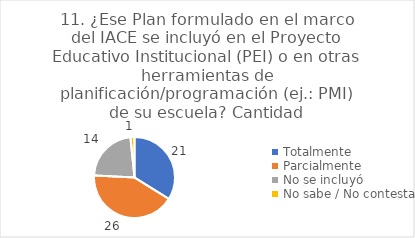
| Category | 11. ¿Ese Plan formulado en el marco del IACE se incluyó en el Proyecto Educativo Institucional (PEI) o en otras herramientas de planificación/programación (ej.: PMI) de su escuela? |
|---|---|
| Totalmente  | 0.339 |
| Parcialmente  | 0.419 |
| No se incluyó  | 0.226 |
| No sabe / No contesta | 0.016 |